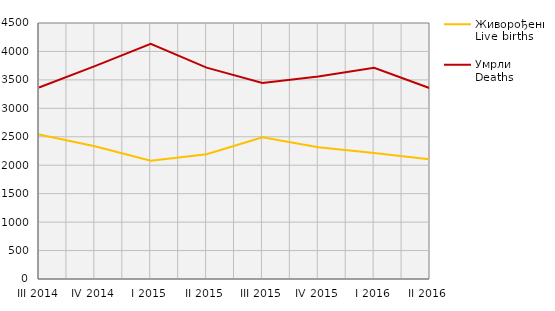
| Category | Живорођени
Live births | Умрли
Deaths |
|---|---|---|
| III 2014 | 2540 | 3367 |
| IV 2014 | 2332 | 3743 |
| I 2015 | 2078 | 4132 |
| II 2015 | 2194 | 3716 |
| III 2015 | 2492 | 3444 |
| IV 2015 | 2315 | 3560 |
| I 2016 | 2216 | 3714 |
| II 2016 | 2101 | 3353 |